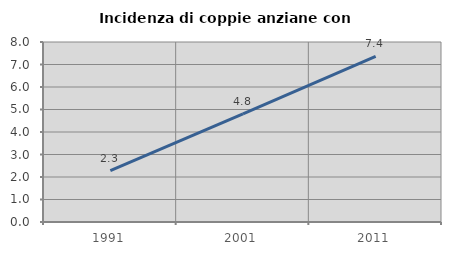
| Category | Incidenza di coppie anziane con figli |
|---|---|
| 1991.0 | 2.286 |
| 2001.0 | 4.81 |
| 2011.0 | 7.362 |